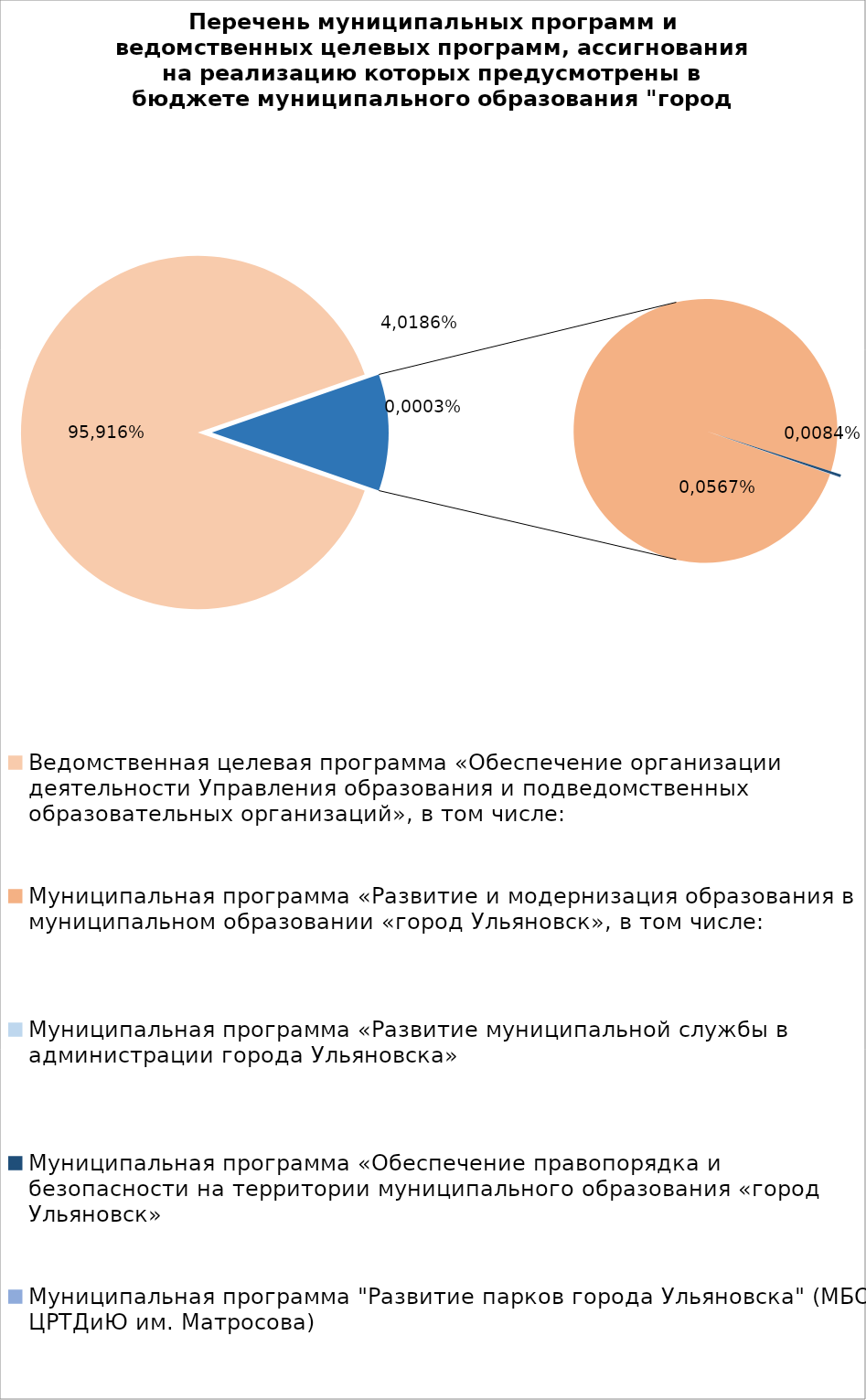
| Category | Series 0 |
|---|---|
| Ведомственная целевая программа «Обеспечение организации деятельности Управления образования и подведомственных образовательных организаций», в том числе: | 7053636.15 |
| Муниципальная программа «Развитие и модернизация образования в муниципальном образовании «город Ульяновск», в том числе: | 838322.41 |
| Муниципальная программа «Развитие муниципальной службы в администрации города Ульяновска» | 14.3 |
| Муниципальная программа «Обеспечение правопорядка и безопасности на территории муниципального образования «город Ульяновск» | 2700 |
| Муниципальная программа "Развитие парков города Ульяновска" (МБОУ ЦРТДиЮ им. Матросова) | 400 |